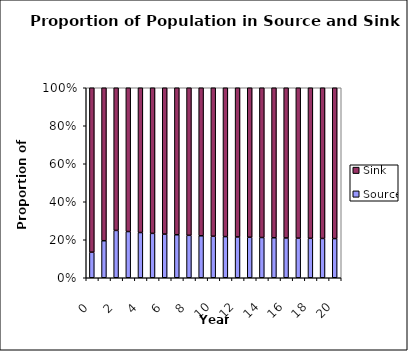
| Category | Source | Sink |
|---|---|---|
| 0.0 | 14 | 90 |
| 1.0 | 19.6 | 81 |
| 2.0 | 25 | 75.34 |
| 3.0 | 25 | 77.806 |
| 4.0 | 25 | 80.025 |
| 5.0 | 25 | 82.023 |
| 6.0 | 25 | 83.821 |
| 7.0 | 25 | 85.439 |
| 8.0 | 25 | 86.895 |
| 9.0 | 25 | 88.205 |
| 10.0 | 25 | 89.385 |
| 11.0 | 25 | 90.446 |
| 12.0 | 25 | 91.402 |
| 13.0 | 25 | 92.261 |
| 14.0 | 25 | 93.035 |
| 15.0 | 25 | 93.732 |
| 16.0 | 25 | 94.359 |
| 17.0 | 25 | 94.923 |
| 18.0 | 25 | 95.43 |
| 19.0 | 25 | 95.887 |
| 20.0 | 25 | 96.299 |